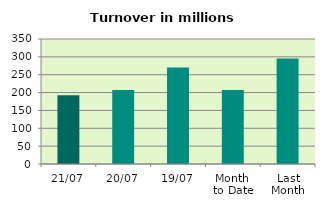
| Category | Series 0 |
|---|---|
| 21/07 | 192.238 |
| 20/07 | 206.935 |
| 19/07 | 270.183 |
| Month 
to Date | 207.443 |
| Last
Month | 295.453 |